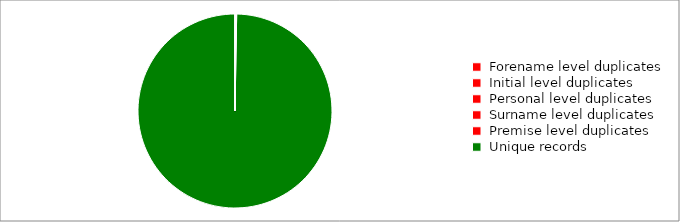
| Category | Series 0 |
|---|---|
|  Forename level duplicates  | 21 |
|  Initial level duplicates  | 6 |
|  Personal level duplicates  | 13 |
|  Surname level duplicates  | 66 |
|  Premise level duplicates  | -106 |
|  Unique records  | 76320 |